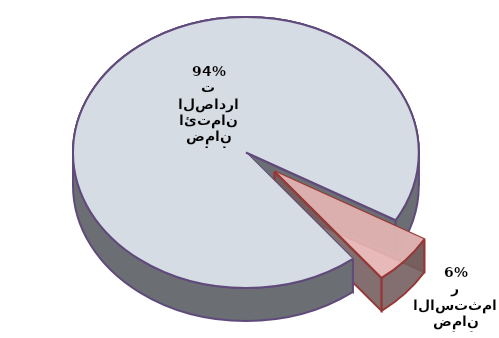
| Category | Series 0 |
|---|---|
| عمليات ضمان الاستثمار | 110.897 |
| عمليات ضمان ائتمان الصادرات | 1723.04 |